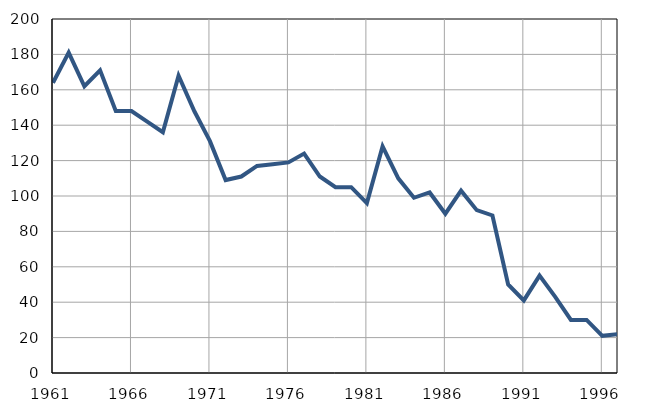
| Category | Infants
deaths |
|---|---|
| 1961.0 | 164 |
| 1962.0 | 181 |
| 1963.0 | 162 |
| 1964.0 | 171 |
| 1965.0 | 148 |
| 1966.0 | 148 |
| 1967.0 | 142 |
| 1968.0 | 136 |
| 1969.0 | 168 |
| 1970.0 | 148 |
| 1971.0 | 131 |
| 1972.0 | 109 |
| 1973.0 | 111 |
| 1974.0 | 117 |
| 1975.0 | 118 |
| 1976.0 | 119 |
| 1977.0 | 124 |
| 1978.0 | 111 |
| 1979.0 | 105 |
| 1980.0 | 105 |
| 1981.0 | 96 |
| 1982.0 | 128 |
| 1983.0 | 110 |
| 1984.0 | 99 |
| 1985.0 | 102 |
| 1986.0 | 90 |
| 1987.0 | 103 |
| 1988.0 | 92 |
| 1989.0 | 89 |
| 1990.0 | 50 |
| 1991.0 | 41 |
| 1992.0 | 55 |
| 1993.0 | 43 |
| 1994.0 | 30 |
| 1995.0 | 30 |
| 1996.0 | 21 |
| 1997.0 | 22 |